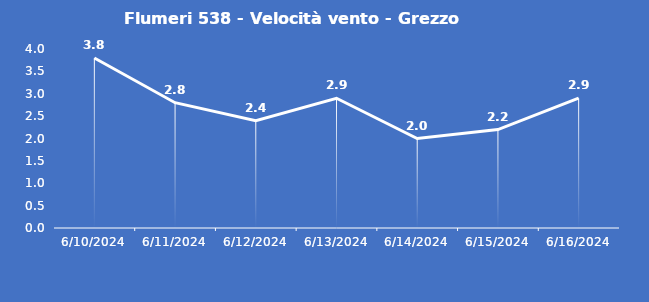
| Category | Flumeri 538 - Velocità vento - Grezzo (m/s) |
|---|---|
| 6/10/24 | 3.8 |
| 6/11/24 | 2.8 |
| 6/12/24 | 2.4 |
| 6/13/24 | 2.9 |
| 6/14/24 | 2 |
| 6/15/24 | 2.2 |
| 6/16/24 | 2.9 |